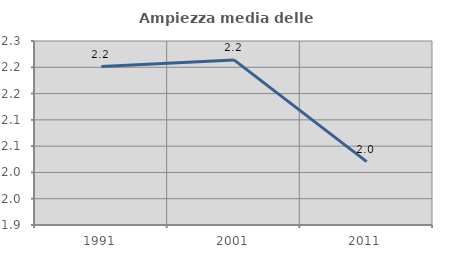
| Category | Ampiezza media delle famiglie |
|---|---|
| 1991.0 | 2.201 |
| 2001.0 | 2.214 |
| 2011.0 | 2.021 |